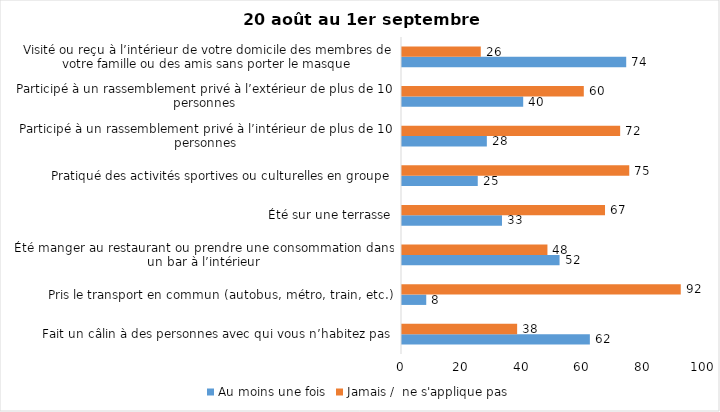
| Category | Au moins une fois | Jamais /  ne s'applique pas |
|---|---|---|
| Fait un câlin à des personnes avec qui vous n’habitez pas | 62 | 38 |
| Pris le transport en commun (autobus, métro, train, etc.) | 8 | 92 |
| Été manger au restaurant ou prendre une consommation dans un bar à l’intérieur | 52 | 48 |
| Été sur une terrasse | 33 | 67 |
| Pratiqué des activités sportives ou culturelles en groupe | 25 | 75 |
| Participé à un rassemblement privé à l’intérieur de plus de 10 personnes | 28 | 72 |
| Participé à un rassemblement privé à l’extérieur de plus de 10 personnes | 40 | 60 |
| Visité ou reçu à l’intérieur de votre domicile des membres de votre famille ou des amis sans porter le masque | 74 | 26 |